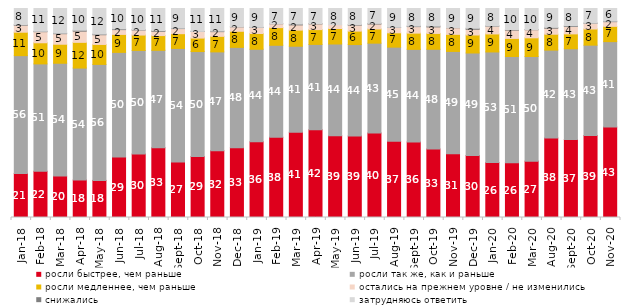
| Category | росли быстрее, чем раньше | росли так же, как и раньше | росли медленнее, чем раньше | остались на прежнем уровне / не изменились | снижались | затрудняюсь ответить |
|---|---|---|---|---|---|---|
| 2018-01-01 | 21.1 | 56.35 | 11.2 | 3.35 | 0.25 | 7.75 |
| 2018-02-01 | 22.1 | 51.4 | 10.1 | 5.3 | 0.2 | 10.9 |
| 2018-03-01 | 19.8 | 54 | 9.1 | 5.05 | 0.25 | 11.8 |
| 2018-04-01 | 17.95 | 53.55 | 12.3 | 5.35 | 0.45 | 10.4 |
| 2018-05-01 | 17.75 | 55.5 | 9.55 | 4.65 | 0.3 | 12.25 |
| 2018-06-01 | 28.9 | 50.1 | 8.6 | 2.3 | 0.35 | 9.75 |
| 2018-07-01 | 30.35 | 49.6 | 7.35 | 2.4 | 0.15 | 10.15 |
| 2018-08-01 | 33.35 | 46.65 | 7.05 | 2 | 0.35 | 10.6 |
| 2018-09-01 | 26.55 | 54.35 | 7.05 | 2.45 | 0.2 | 9.4 |
| 2018-10-01 | 29.2 | 50.2 | 6.45 | 3.15 | 0.05 | 10.95 |
| 2018-11-01 | 31.886 | 47.355 | 7.435 | 2.246 | 0.299 | 10.778 |
| 2018-12-01 | 33.4 | 48 | 7.7 | 2.1 | 0.05 | 8.75 |
| 2019-01-01 | 36.25 | 44.25 | 7.55 | 2.85 | 0.1 | 9 |
| 2019-02-01 | 38.35 | 44.05 | 8.45 | 1.85 | 0.05 | 7.25 |
| 2019-03-01 | 40.825 | 41.124 | 7.708 | 2.486 | 0.398 | 7.459 |
| 2019-04-01 | 42.03 | 40.792 | 7.079 | 2.723 | 0.149 | 7.228 |
| 2019-05-01 | 39.079 | 43.933 | 7.429 | 1.783 | 0 | 7.776 |
| 2019-06-01 | 39.052 | 43.691 | 6.434 | 2.843 | 0.249 | 7.731 |
| 2019-07-01 | 40.396 | 43.02 | 6.782 | 2.376 | 0.297 | 7.129 |
| 2019-08-01 | 36.513 | 45.005 | 6.843 | 2.547 | 0.1 | 8.991 |
| 2019-09-01 | 36.139 | 44.307 | 7.772 | 3.119 | 0.248 | 8.416 |
| 2019-10-01 | 32.822 | 47.673 | 7.574 | 3.119 | 0.396 | 8.416 |
| 2019-11-01 | 30.545 | 48.911 | 8.168 | 3.168 | 0.099 | 9.109 |
| 2019-12-01 | 29.653 | 49.059 | 8.614 | 2.723 | 0.495 | 9.455 |
| 2020-01-01 | 26.287 | 52.921 | 8.614 | 3.713 | 0.149 | 8.317 |
| 2020-02-01 | 26.139 | 50.891 | 8.663 | 3.96 | 0.297 | 10.05 |
| 2020-03-01 | 26.971 | 50.074 | 8.924 | 3.867 | 0.099 | 10.064 |
| 2020-08-01 | 38.083 | 42.006 | 7.597 | 2.88 | 0.397 | 9.037 |
| 2020-09-01 | 37.282 | 43.454 | 7.118 | 3.534 | 0.348 | 8.263 |
| 2020-10-01 | 39.213 | 43.249 | 7.723 | 2.74 | 0.1 | 6.976 |
| 2020-11-01 | 43.3 | 40.85 | 7.3 | 2.25 | 0.25 | 6.05 |